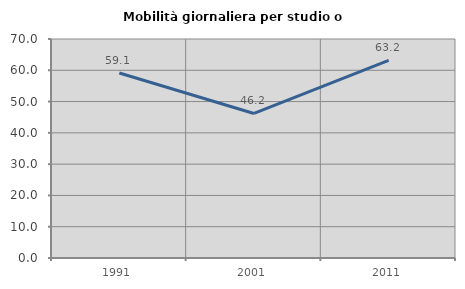
| Category | Mobilità giornaliera per studio o lavoro |
|---|---|
| 1991.0 | 59.146 |
| 2001.0 | 46.203 |
| 2011.0 | 63.158 |